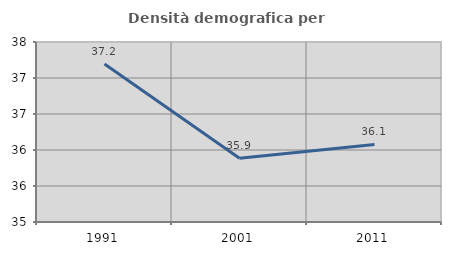
| Category | Densità demografica |
|---|---|
| 1991.0 | 37.194 |
| 2001.0 | 35.885 |
| 2011.0 | 36.077 |